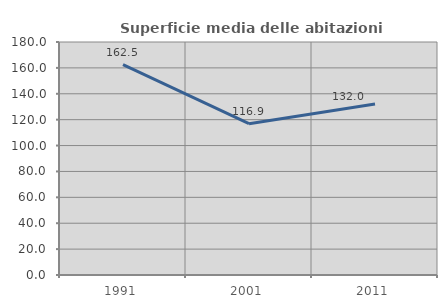
| Category | Superficie media delle abitazioni occupate |
|---|---|
| 1991.0 | 162.462 |
| 2001.0 | 116.903 |
| 2011.0 | 132.036 |